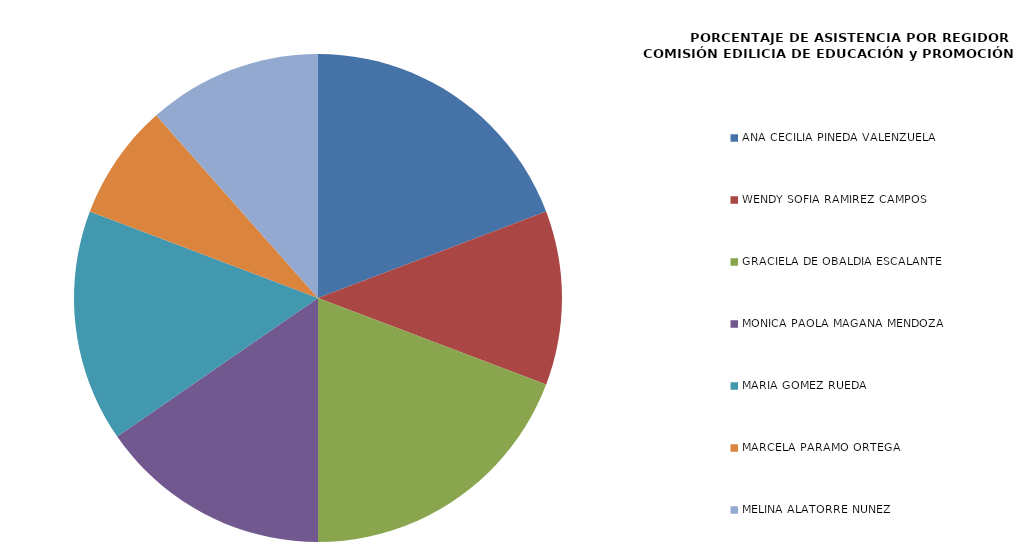
| Category | Series 0 |
|---|---|
| ANA CECILIA PINEDA VALENZUELA | 100 |
| WENDY SOFÍA RAMÍREZ CAMPOS | 60 |
| GRACIELA DE OBALDÍA ESCALANTE | 100 |
| MÓNICA PAOLA MAGAÑA MENDOZA | 80 |
| MARÍA GÓMEZ RUEDA | 80 |
| MARCELA PÁRAMO ORTEGA | 40 |
| MELINA ALATORRE NÚÑEZ | 60 |